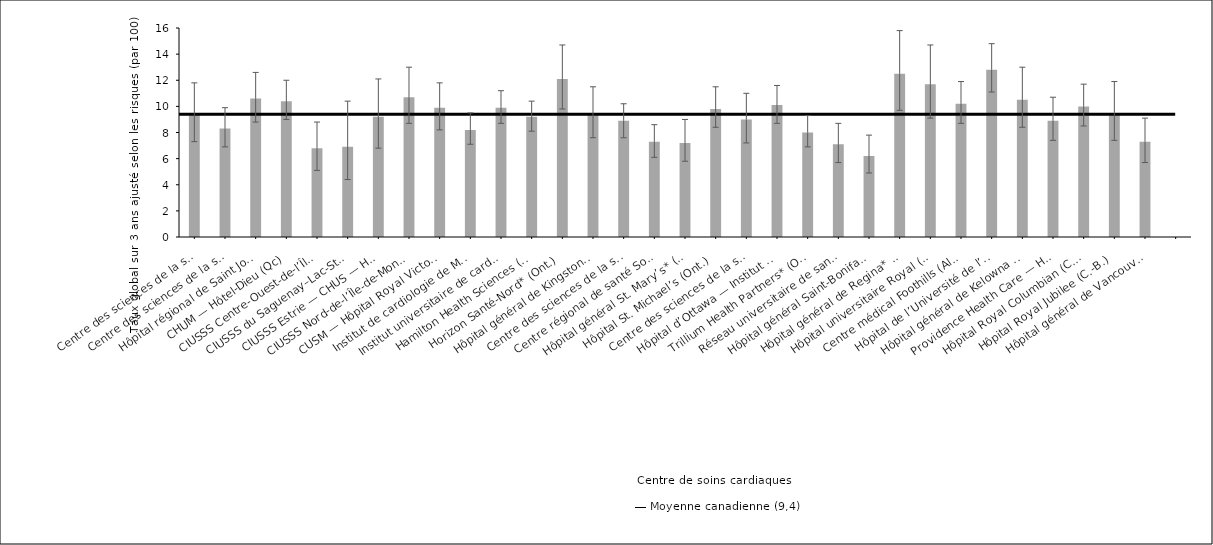
| Category | Taux ajusté selon les risques |
|---|---|
| Centre des sciences de la santé — St. John’s (T.-N.-L.) | 9.4 |
| Centre des sciences de la santé Queen Elizabeth II (N.-É.) | 8.3 |
| Hôpital régional de Saint John (N.-B.) | 10.6 |
| CHUM — Hôtel-Dieu (Qc) | 10.4 |
| CIUSSS Centre-Ouest-de-l’Île-de-Mtl — Hôpital général juif* (Qc) | 6.8 |
| CIUSSS du Saguenay–Lac-St-Jean — Hôpital de Chicoutimi (Qc) | 6.9 |
| CIUSSS Estrie — CHUS — Hôpital Fleurimont (Qc) | 9.2 |
| CIUSSS Nord-de-l’Île-de-Montréal — Hôpital du Sacré-Cœur de Montréal (Qc) | 10.7 |
| CUSM — Hôpital Royal Victoria (Qc) | 9.9 |
| Institut de cardiologie de Montréal (Qc) | 8.2 |
| Institut universitaire de cardiologie et pneumologie de Québec (Qc) | 9.9 |
| Hamilton Health Sciences (Ont.) | 9.2 |
| Horizon Santé-Nord* (Ont.) | 12.1 |
| Hôpital général de Kingston (Ont.) | 9.4 |
| Centre des sciences de la santé de London (Ont.) | 8.9 |
| Centre régional de santé Southlake* (Ont.) | 7.3 |
| Hôpital général St. Mary’s* (Ont.) | 7.2 |
| Hôpital St. Michael’s (Ont.) | 9.8 |
| Centre des sciences de la santé Sunnybrook (Ont.) | 9 |
| Hôpital d’Ottawa — Institut de cardiologie de l’Université d’Ottawa (Ont.) | 10.1 |
| Trillium Health Partners* (Ont.) | 8 |
| Réseau universitaire de santé* (Ont.) | 7.1 |
| Hôpital général Saint-Boniface* (Man.) | 6.2 |
| Hôpital général de Regina* (Sask.) | 12.5 |
| Hôpital universitaire Royal (Sask.) | 11.7 |
| Centre médical Foothills (Alb.) | 10.2 |
| Hôpital de l’Université de l’Alberta* (Alb.) | 12.8 |
| Hôpital général de Kelowna (C.-B.) | 10.5 |
| Providence Health Care — Hôpital St. Paul’s (Vancouver) (C.-B.) | 8.9 |
| Hôpital Royal Columbian (C.-B.) | 10 |
| Hôpital Royal Jubilee (C.-B.) | 9.5 |
| Hôpital général de Vancouver* (C.-B.) | 7.3 |